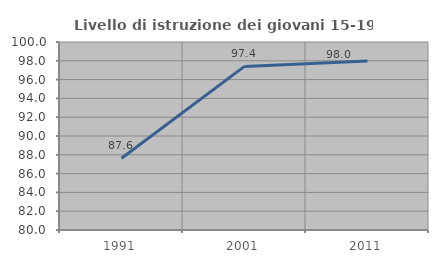
| Category | Livello di istruzione dei giovani 15-19 anni |
|---|---|
| 1991.0 | 87.636 |
| 2001.0 | 97.405 |
| 2011.0 | 97.977 |